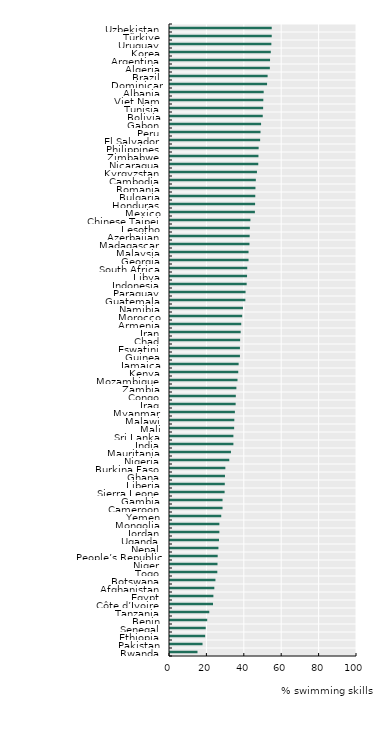
| Category | Series 0 |
|---|---|
| Rwanda | 14.7 |
| Pakistan | 17.4 |
| Ethiopia | 18.8 |
| Senegal | 19.1 |
| Benin | 19.9 |
| Tanzania | 21 |
| Côte d’Ivoire | 23 |
| Egypt | 23.2 |
| Afghanistan | 23.7 |
| Botswana | 24.3 |
| Togo | 25.3 |
| Niger | 25.4 |
| People’s Republic of China  | 25.5 |
| Nepal | 25.9 |
| Uganda | 26.2 |
| Jordan | 26.4 |
| Mongolia | 26.4 |
| Yemen | 27.4 |
| Cameroon | 28.1 |
| Gambia | 28.1 |
| Sierra Leone | 29.2 |
| Liberia | 29.3 |
| Ghana | 29.4 |
| Burkina Faso | 29.6 |
| Nigeria | 31.7 |
| Mauritania | 32.6 |
| India | 33.9 |
| Sri Lanka | 33.9 |
| Mali | 34.3 |
| Malawi | 34.4 |
| Myanmar | 34.7 |
| Iraq | 35.1 |
| Congo | 35.2 |
| Zambia | 35.5 |
| Mozambique | 36.1 |
| Kenya | 36.5 |
| Jamaica | 36.7 |
| Guinea | 37.4 |
| Eswatini | 37.4 |
| Chad | 37.5 |
| Iran | 37.8 |
| Armenia | 38.1 |
| Morocco | 38.6 |
| Namibia | 39 |
| Guatemala | 40.3 |
| Paraguay | 40.4 |
| Indonesia | 41 |
| Libya | 41.2 |
| South Africa | 41.3 |
| Georgia | 42 |
| Malaysia | 42 |
| Madagascar | 42.5 |
| Azerbaijan | 42.6 |
| Lesotho | 42.7 |
| Chinese Taipei | 43 |
| Mexico | 45.4 |
| Honduras | 45.5 |
| Bulgaria | 45.6 |
| Romania | 45.7 |
| Cambodia | 45.9 |
| Kyrgyzstan | 46.5 |
| Nicaragua | 47.2 |
| Zimbabwe | 47.3 |
| Philippines | 47.4 |
| El Salvador | 48.2 |
| Peru | 48.4 |
| Gabon | 48.7 |
| Bolivia | 49.6 |
| Tunisia | 49.8 |
| Viet Nam | 49.9 |
| Albania | 50.1 |
| Dominican Republic | 51.9 |
| Brazil | 52.2 |
| Algeria | 53.4 |
| Argentina | 53.5 |
| Korea | 53.9 |
| Uruguay | 54.2 |
| Türkiye | 54.4 |
| Uzbekistan | 54.4 |